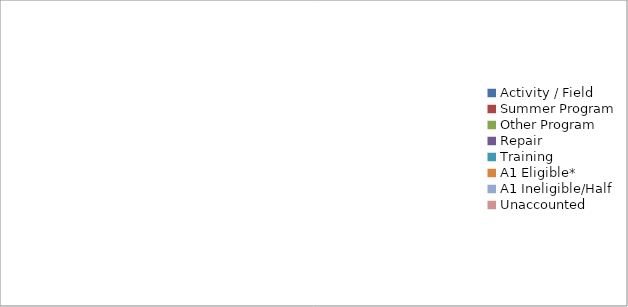
| Category | Series 0 |
|---|---|
| Activity / Field | 0 |
| Summer Program | 0 |
| Other Program | 0 |
| Repair | 0 |
| Training | 0 |
| A1 Eligible* | 0 |
| A1 Ineligible/Half | 0 |
| Unaccounted | 0 |